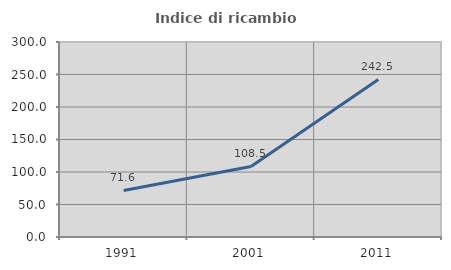
| Category | Indice di ricambio occupazionale  |
|---|---|
| 1991.0 | 71.561 |
| 2001.0 | 108.468 |
| 2011.0 | 242.466 |